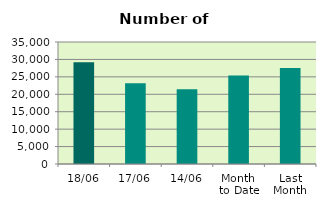
| Category | Series 0 |
|---|---|
| 18/06 | 29164 |
| 17/06 | 23186 |
| 14/06 | 21470 |
| Month 
to Date | 25408.833 |
| Last
Month | 27522.455 |